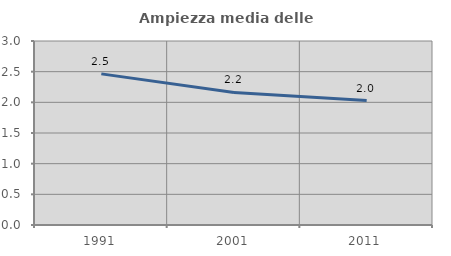
| Category | Ampiezza media delle famiglie |
|---|---|
| 1991.0 | 2.464 |
| 2001.0 | 2.161 |
| 2011.0 | 2.029 |